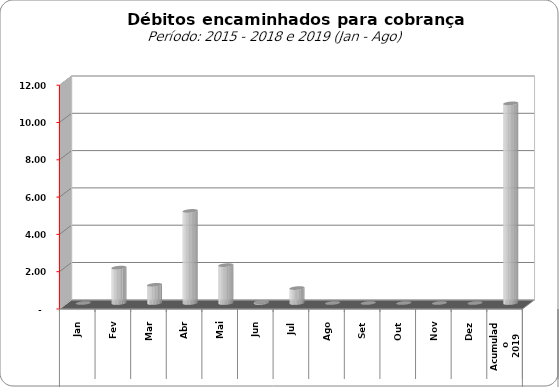
| Category |  3.309.443,02   3.859.728,44   11.181.928,25   7.600.526,01   31.248.623,50   9.830.198,34   20.083.556,95   23.931.734,08   -     1.897.202,11   974.309,37   4.937.737,42   2.030.400,14   66.339,49   799.707,68   -     -     -     -     -     10.705.696, |
|---|---|
| 0 | 0 |
| 1 | 1897202.11 |
| 2 | 974309.37 |
| 3 | 4937737.42 |
| 4 | 2030400.14 |
| 5 | 66339.49 |
| 6 | 799707.68 |
| 7 | 0 |
| 8 | 0 |
| 9 | 0 |
| 10 | 0 |
| 11 | 0 |
| 12 | 10705696.21 |